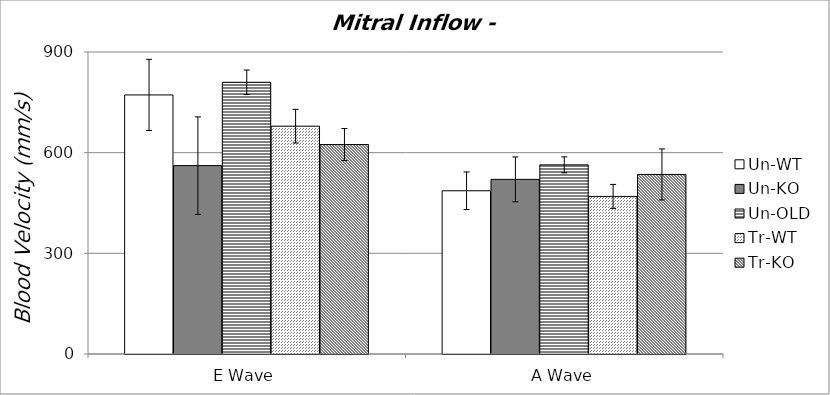
| Category | Un-WT | Un-KO | Un-OLD | Tr-WT | Tr-KO |
|---|---|---|---|---|---|
| 0 | 772.076 | 561.383 | 809.753 | 678.944 | 624.229 |
| 1 | 486.427 | 520.473 | 563.656 | 469.643 | 535.104 |